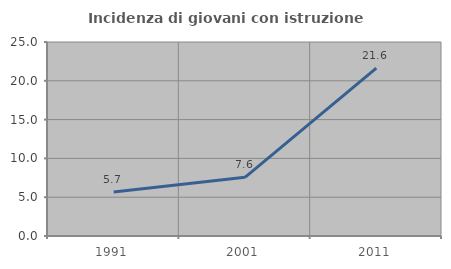
| Category | Incidenza di giovani con istruzione universitaria |
|---|---|
| 1991.0 | 5.66 |
| 2001.0 | 7.563 |
| 2011.0 | 21.642 |